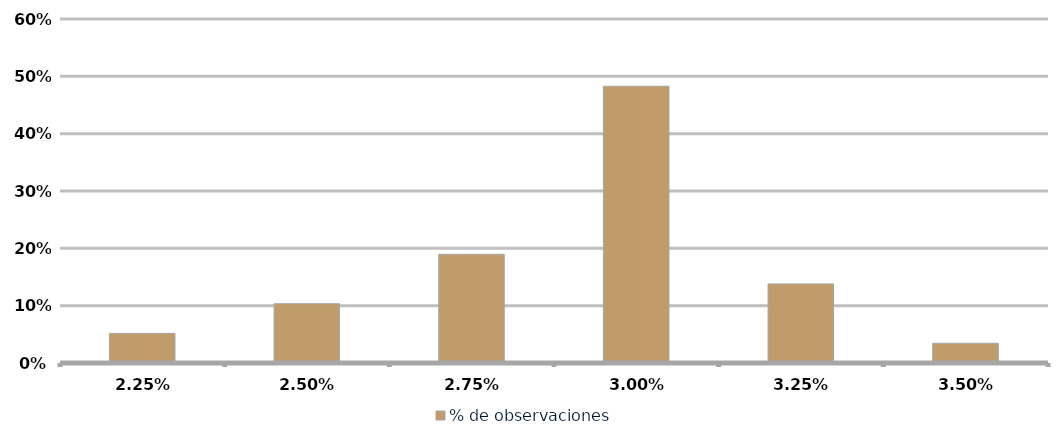
| Category | % de observaciones  |
|---|---|
| 0.022500000000000003 | 0.052 |
| 0.025 | 0.103 |
| 0.0275 | 0.19 |
| 0.03 | 0.483 |
| 0.0325 | 0.138 |
| 0.035 | 0.034 |